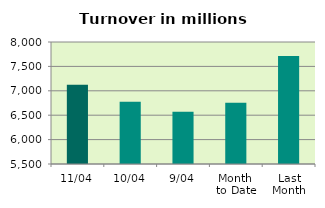
| Category | Series 0 |
|---|---|
| 11/04 | 7121.528 |
| 10/04 | 6775.729 |
| 9/04 | 6569.819 |
| Month 
to Date | 6754.963 |
| Last
Month | 7711.184 |